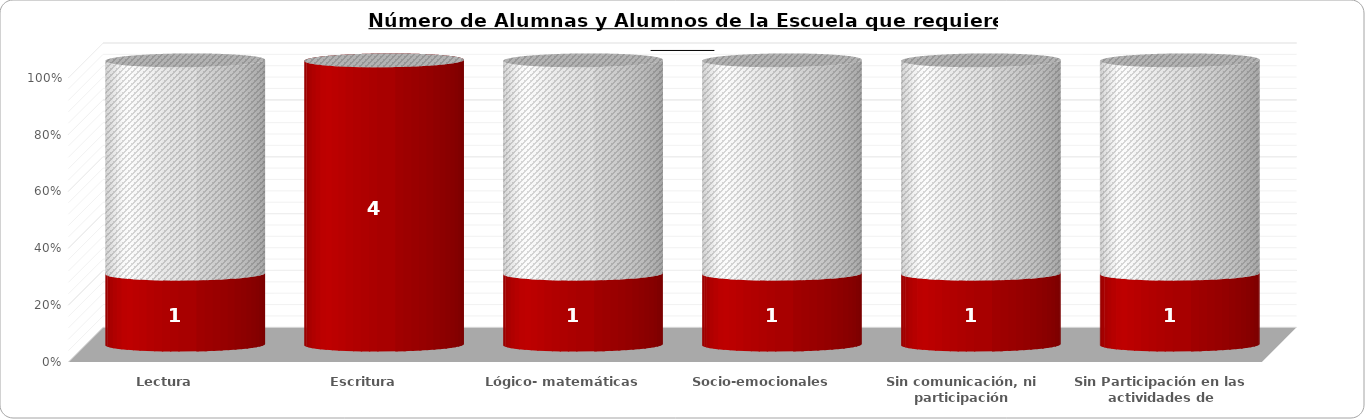
| Category | Series 0 | Diferencia |
|---|---|---|
| Lectura | 1 | 3 |
| Escritura | 4 | 0 |
| Lógico- matemáticas | 1 | 3 |
| Socio-emocionales | 1 | 3 |
| Sin comunicación, ni participación | 1 | 3 |
| Sin Participación en las actividades de aprendizaje  | 1 | 3 |